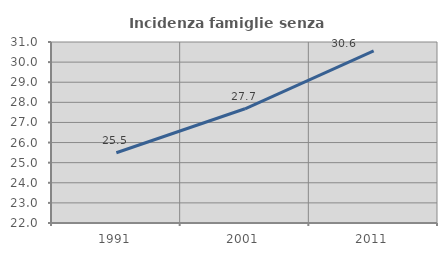
| Category | Incidenza famiglie senza nuclei |
|---|---|
| 1991.0 | 25.493 |
| 2001.0 | 27.68 |
| 2011.0 | 30.56 |